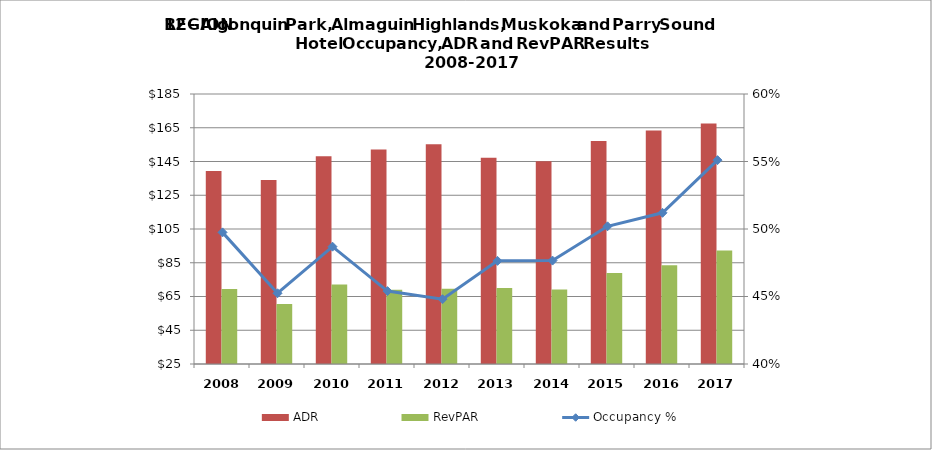
| Category | ADR | RevPAR |
|---|---|---|
| 2008.0 | 139.44 | 69.371 |
| 2009.0 | 134.01 | 60.626 |
| 2010.0 | 148.18 | 72.149 |
| 2011.0 | 152.05 | 69.031 |
| 2012.0 | 155.18 | 69.521 |
| 2013.0 | 147.15 | 70.102 |
| 2014.0 | 145.11 | 69.159 |
| 2015.0 | 157.18 | 78.87 |
| 2016.0 | 163.3 | 83.53 |
| 2017.0 | 167.5 | 92.33 |